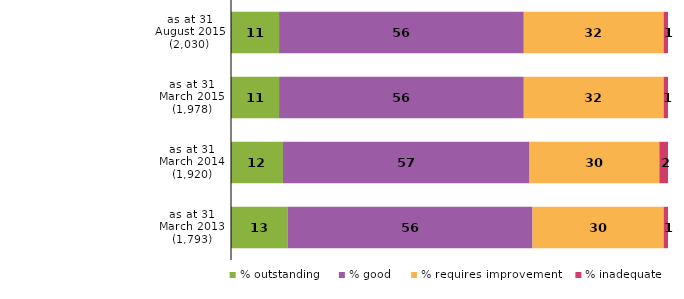
| Category | % outstanding | % good | % requires improvement | % inadequate |
|---|---|---|---|---|
| as at 31 August 2015 (2,030) | 11 | 56 | 32 | 1 |
| as at 31 March 2015 (1,978) | 11 | 56 | 32 | 1 |
| as at 31 March 2014 (1,920) | 12 | 57 | 30 | 2 |
| as at 31 March 2013 (1,793) | 13 | 56 | 30 | 1 |